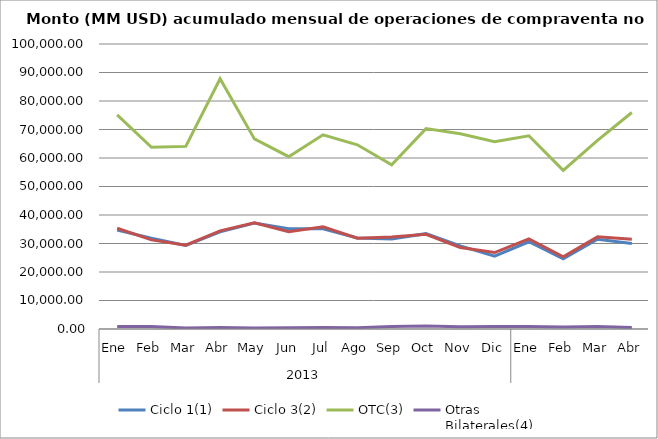
| Category | Ciclo 1(1) | Ciclo 3(2) | OTC(3) | Otras
Bilaterales(4) |
|---|---|---|---|---|
| 0 | 34736.674 | 35336.778 | 75100.994 | 862.558 |
| 1 | 31837.301 | 31276.084 | 63735.014 | 835.426 |
| 2 | 29308.645 | 29417.861 | 64070.642 | 371.583 |
| 3 | 34083.554 | 34428.23 | 87796.406 | 540.738 |
| 4 | 37163.38 | 37242.543 | 66687.424 | 368.797 |
| 5 | 35163.266 | 34165.361 | 60467.987 | 473.52 |
| 6 | 35197.057 | 35828.881 | 68121.887 | 537.978 |
| 7 | 31913.776 | 31846.832 | 64630.867 | 477.656 |
| 8 | 31601.855 | 32260.646 | 57599.123 | 864.94 |
| 9 | 33455.872 | 33201.092 | 70316.044 | 1074.052 |
| 10 | 29141.89 | 28620.849 | 68482.193 | 758.559 |
| 11 | 25532.796 | 26816.016 | 65678.317 | 842.072 |
| 12 | 30609.998 | 31608.391 | 67807.808 | 838.473 |
| 13 | 24661.445 | 25355.64 | 55646.165 | 717.558 |
| 14 | 31490.456 | 32327.003 | 66188.016 | 905.778 |
| 15 | 29968.466 | 31511.409 | 75953.393 | 552.114 |